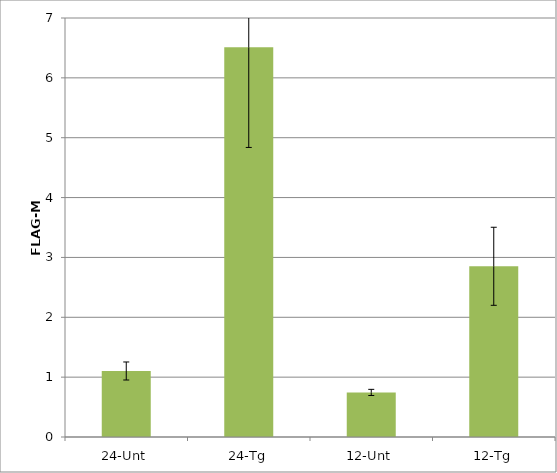
| Category | FLAG-M1 |
|---|---|
| 24-Unt | 1.103 |
| 24-Tg | 6.509 |
| 12-Unt | 0.745 |
| 12-Tg | 2.852 |